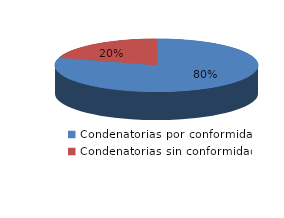
| Category | Series 0 |
|---|---|
| 0 | 1481 |
| 1 | 379 |